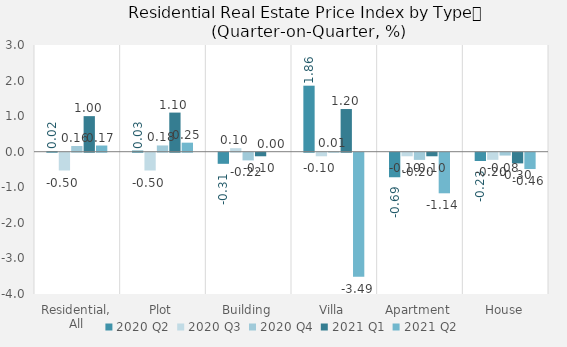
| Category | 2020 | 2021 |
|---|---|---|
| Residential, All | 0.16 | 0.174 |
| Plot | 0.176 | 0.254 |
| Building | -0.216 | 0 |
| Villa | 0.009 | -3.489 |
| Apartment | -0.202 | -1.141 |
| House | -0.08 | -0.459 |